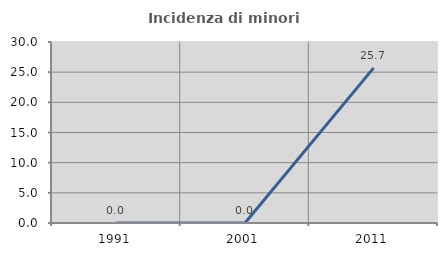
| Category | Incidenza di minori stranieri |
|---|---|
| 1991.0 | 0 |
| 2001.0 | 0 |
| 2011.0 | 25.714 |